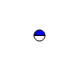
| Category | Series 0 |
|---|---|
| 0 | 1175959 |
| 1 | 1158953 |